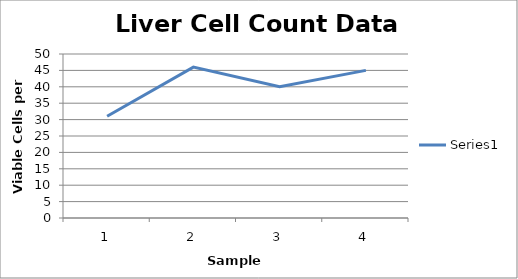
| Category | Series 0 |
|---|---|
| 0 | 31 |
| 1 | 46 |
| 2 | 40 |
| 3 | 45 |